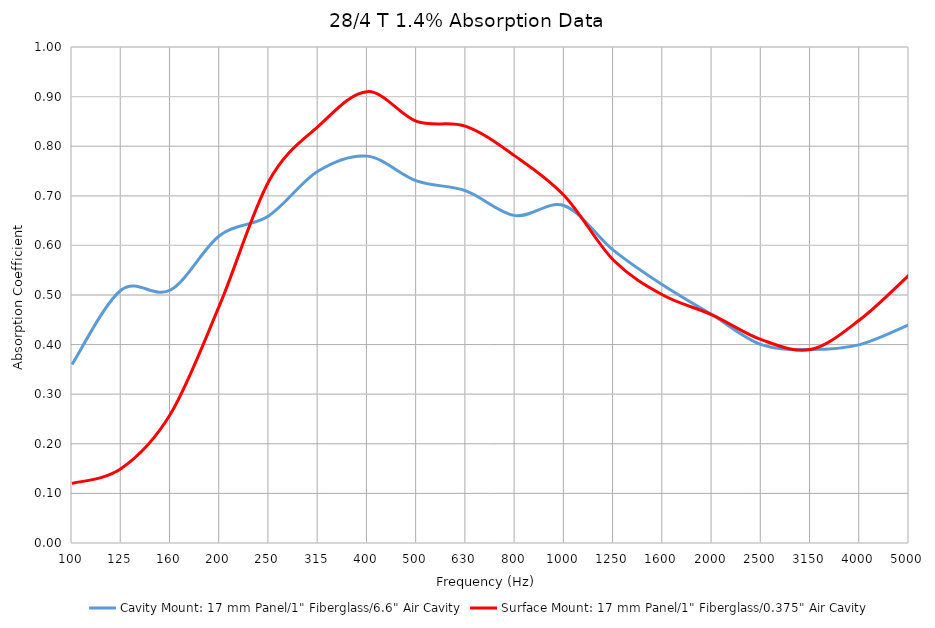
| Category | Cavity Mount: 17 mm Panel/1" Fiberglass/6.6" Air Cavity | Surface Mount: 17 mm Panel/1" Fiberglass/0.375" Air Cavity |
|---|---|---|
| 100.0 | 0.36 | 0.12 |
| 125.0 | 0.51 | 0.15 |
| 160.0 | 0.51 | 0.26 |
| 200.0 | 0.62 | 0.48 |
| 250.0 | 0.66 | 0.73 |
| 315.0 | 0.75 | 0.84 |
| 400.0 | 0.78 | 0.91 |
| 500.0 | 0.73 | 0.85 |
| 630.0 | 0.71 | 0.84 |
| 800.0 | 0.66 | 0.78 |
| 1000.0 | 0.68 | 0.7 |
| 1250.0 | 0.59 | 0.57 |
| 1600.0 | 0.52 | 0.5 |
| 2000.0 | 0.46 | 0.46 |
| 2500.0 | 0.4 | 0.41 |
| 3150.0 | 0.39 | 0.39 |
| 4000.0 | 0.4 | 0.45 |
| 5000.0 | 0.44 | 0.54 |